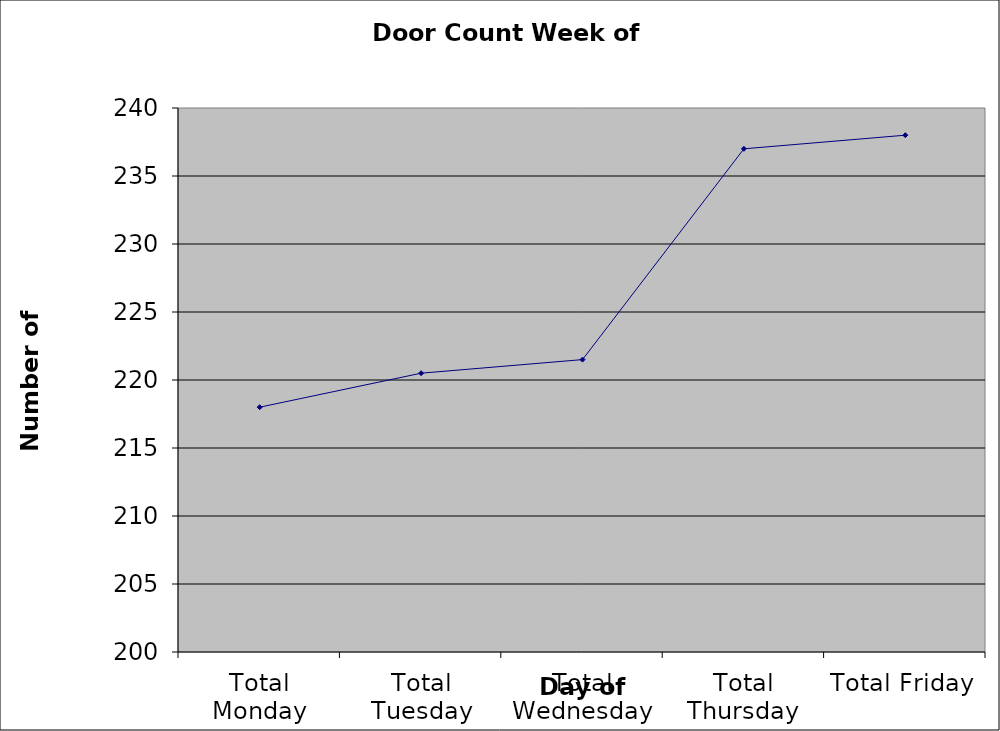
| Category | Series 0 |
|---|---|
| Total Monday | 218 |
| Total Tuesday | 220.5 |
| Total Wednesday | 221.5 |
| Total Thursday | 237 |
| Total Friday | 238 |